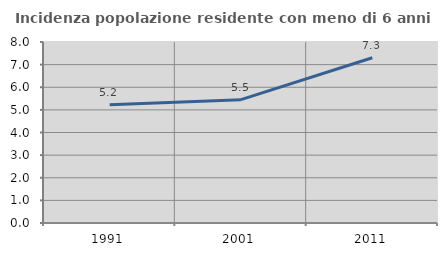
| Category | Incidenza popolazione residente con meno di 6 anni |
|---|---|
| 1991.0 | 5.227 |
| 2001.0 | 5.45 |
| 2011.0 | 7.304 |